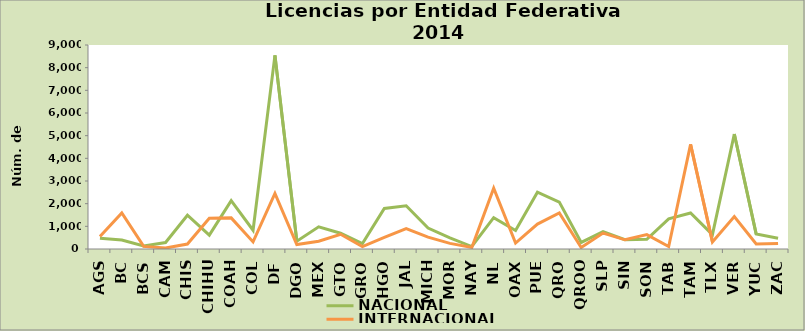
| Category | NACIONAL | INTERNACIONAL |
|---|---|---|
| AGS | 475 | 547 |
| BC | 395 | 1589 |
| BCS | 138 | 114 |
| CAM | 285 | 42 |
| CHIS | 1491 | 219 |
| CHIHU | 611 | 1356 |
| COAH | 2133 | 1373 |
| COL | 828 | 313 |
| DF | 8542 | 2451 |
| DGO | 347 | 198 |
| MEX | 981 | 340 |
| GTO | 697 | 648 |
| GRO | 241 | 108 |
| HGO | 1791 | 515 |
| JAL | 1907 | 904 |
| MICH | 922 | 522 |
| MOR | 490 | 249 |
| NAY | 109 | 69 |
| NL | 1381 | 2685 |
| OAX | 815 | 264 |
| PUE | 2508 | 1099 |
| QRO | 2072 | 1589 |
| QROO | 290 | 67 |
| SLP | 765 | 702 |
| SIN | 410 | 405 |
| SON | 431 | 635 |
| TAB | 1329 | 112 |
| TAM | 1591 | 4616 |
| TLX | 633 | 311 |
| VER | 5072 | 1430 |
| YUC | 658 | 218 |
| ZAC | 472 | 248 |